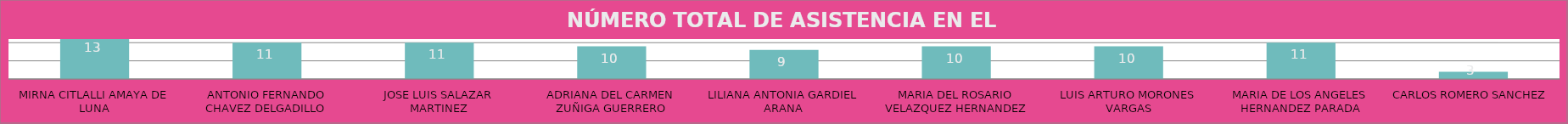
| Category | MIRNA CITLALLI AMAYA DE LUNA |
|---|---|
| MIRNA CITLALLI AMAYA DE LUNA | 13 |
| ANTONIO FERNANDO CHAVEZ DELGADILLO | 11 |
| JOSE LUIS SALAZAR MARTINEZ | 11 |
| ADRIANA DEL CARMEN ZUÑIGA GUERRERO | 10 |
| LILIANA ANTONIA GARDIEL ARANA | 9 |
| MARIA DEL ROSARIO VELAZQUEZ HERNANDEZ | 10 |
| LUIS ARTURO MORONES VARGAS | 10 |
| MARIA DE LOS ANGELES HERNANDEZ PARADA | 11 |
| CARLOS ROMERO SANCHEZ | 3 |